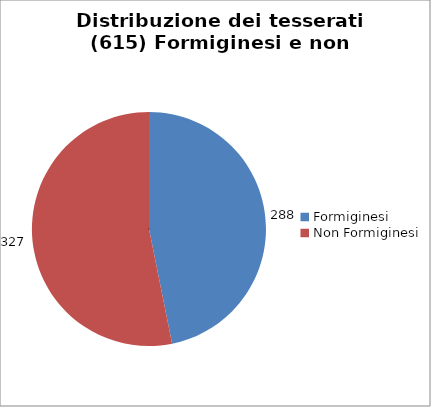
| Category | Nr. Tesserati |
|---|---|
| Formiginesi | 288 |
| Non Formiginesi | 327 |